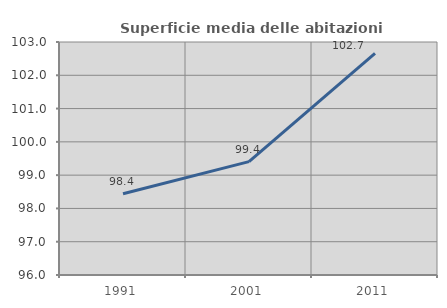
| Category | Superficie media delle abitazioni occupate |
|---|---|
| 1991.0 | 98.442 |
| 2001.0 | 99.406 |
| 2011.0 | 102.657 |